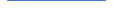
| Category | Series 0 |
|---|---|
| 0 | 4185.664 |
| 1 | 4076.944 |
| 2 | 3844.553 |
| 3 | 3589.04 |
| 4 | 3480.174 |
| 5 | 3369.167 |
| 6 | 3706 |
| 7 | 3427 |
| 8 | 3288 |